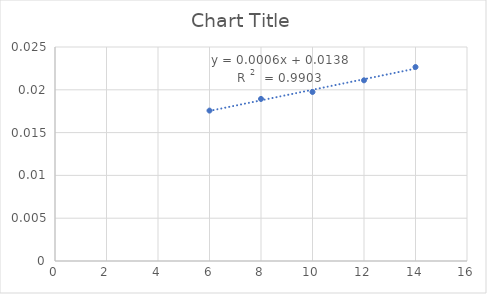
| Category | Series 0 |
|---|---|
| 6.0 | 0.018 |
| 8.0 | 0.019 |
| 10.0 | 0.02 |
| 12.0 | 0.021 |
| 14.0 | 0.023 |